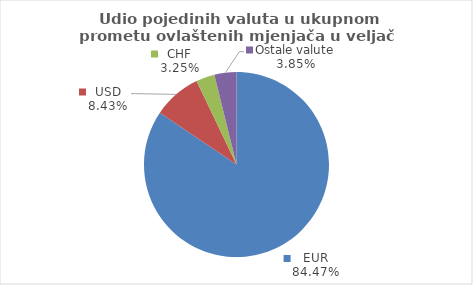
| Category | Series 0 |
|---|---|
| EUR | 84.472 |
| USD | 8.428 |
| CHF | 3.252 |
| Ostale valute | 3.848 |